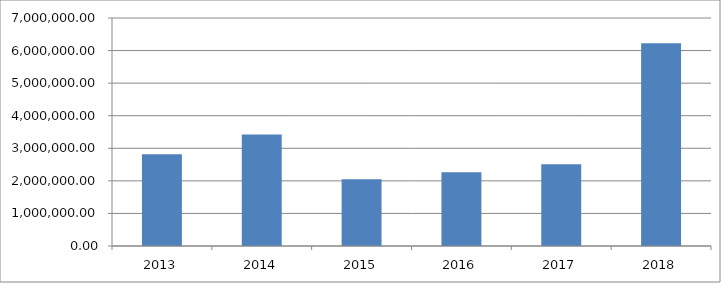
| Category | Series 0 |
|---|---|
| 2013.0 | 2815872.174 |
| 2014.0 | 3424085.775 |
| 2015.0 | 2046157.415 |
| 2016.0 | 2260939.399 |
| 2017.0 | 2513647.703 |
| 2018.0 | 6228107.698 |